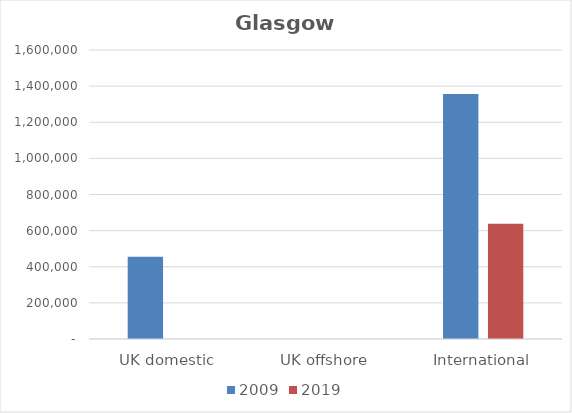
| Category | 2009 | 2019 |
|---|---|---|
| UK domestic | 455634 | 215 |
| UK offshore | 0 | 0 |
| International | 1356591 | 637769 |